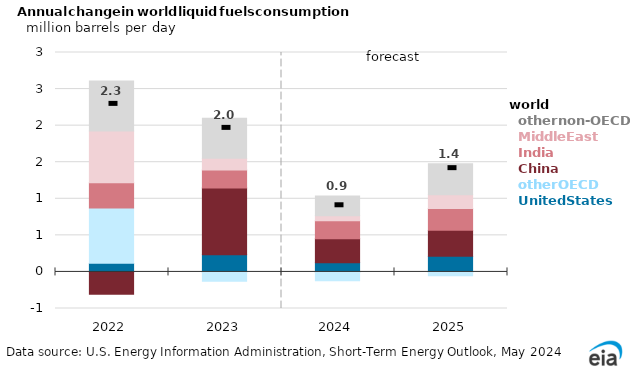
| Category | United States | Other OECD | China | India | Middle East | Other non-OECD |
|---|---|---|---|---|---|---|
| 2022.0 | 0.12 | 0.755 | -0.305 | 0.342 | 0.707 | 0.685 |
| 2023.0 | 0.236 | -0.126 | 0.911 | 0.246 | 0.163 | 0.548 |
| 2024.0 | 0.126 | -0.122 | 0.326 | 0.248 | 0.069 | 0.271 |
| 2025.0 | 0.214 | -0.053 | 0.355 | 0.298 | 0.189 | 0.423 |